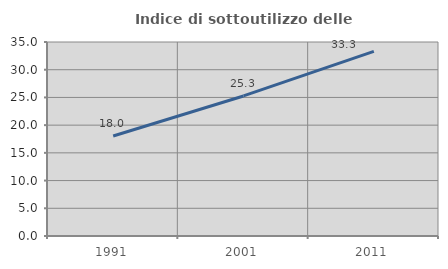
| Category | Indice di sottoutilizzo delle abitazioni  |
|---|---|
| 1991.0 | 18.037 |
| 2001.0 | 25.268 |
| 2011.0 | 33.294 |